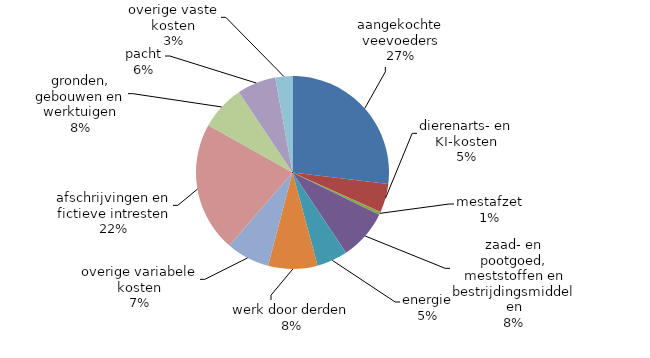
| Category | 2018* |
|---|---|
| aangekochte veevoeders | 68466.66 |
| dierenarts- en KI-kosten | 12169.672 |
| mestafzet | 1352.783 |
| zaad- en pootgoed, meststoffen en bestrijdingsmiddelen | 21426.673 |
| energie | 13133.766 |
| werk door derden | 21042.661 |
| overige variabele kosten | 18500.601 |
| afschrijvingen en fictieve intresten | 55426.309 |
| gronden, gebouwen en werktuigen | 19088.915 |
| pacht | 16514.047 |
| overige vaste kosten | 7318.485 |